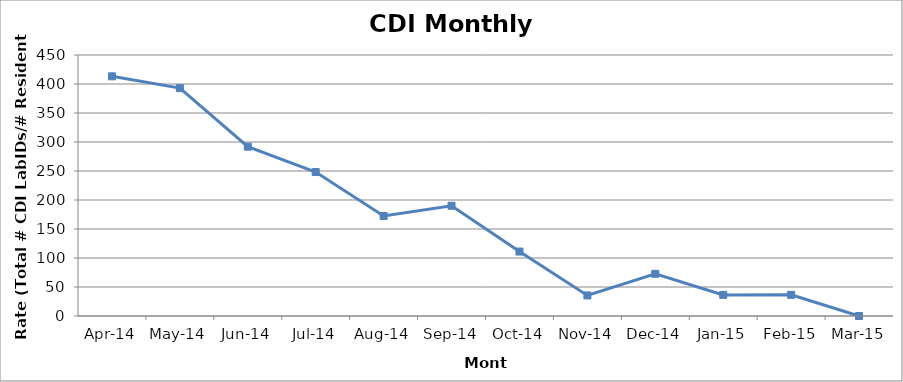
| Category | Series 2 |
|---|---|
| 2014-04-01 | 413.223 |
| 2014-05-01 | 392.857 |
| 2014-06-01 | 291.971 |
| 2014-07-01 | 248.227 |
| 2014-08-01 | 172.414 |
| 2014-09-01 | 190.114 |
| 2014-10-01 | 111.111 |
| 2014-11-01 | 35.461 |
| 2014-12-01 | 72.727 |
| 2015-01-01 | 36.364 |
| 2015-02-01 | 36.496 |
| 2015-03-01 | 0 |